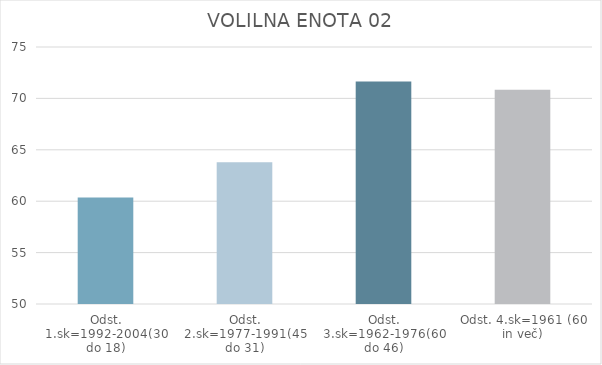
| Category | Series 0 |
|---|---|
| Odst. 1.sk=1992-2004(30 do 18) | 60.37 |
| Odst. 2.sk=1977-1991(45 do 31) | 63.78 |
| Odst. 3.sk=1962-1976(60 do 46) | 71.65 |
| Odst. 4.sk=1961 (60 in več) | 70.83 |